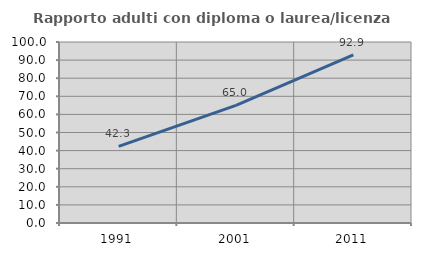
| Category | Rapporto adulti con diploma o laurea/licenza media  |
|---|---|
| 1991.0 | 42.316 |
| 2001.0 | 64.982 |
| 2011.0 | 92.89 |